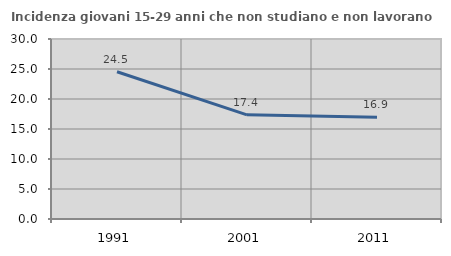
| Category | Incidenza giovani 15-29 anni che non studiano e non lavorano  |
|---|---|
| 1991.0 | 24.54 |
| 2001.0 | 17.355 |
| 2011.0 | 16.949 |